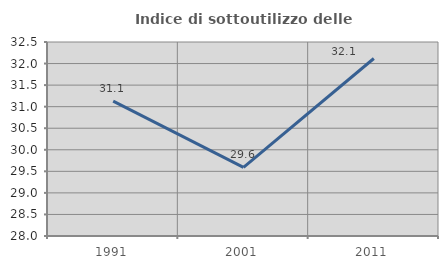
| Category | Indice di sottoutilizzo delle abitazioni  |
|---|---|
| 1991.0 | 31.128 |
| 2001.0 | 29.591 |
| 2011.0 | 32.117 |